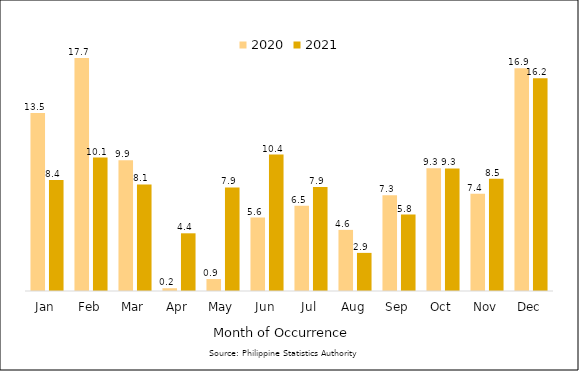
| Category | 2020 | 2021 |
|---|---|---|
| Jan | 13.543 | 8.444 |
| Feb | 17.715 | 10.147 |
| Mar | 9.948 | 8.105 |
| Apr | 0.211 | 4.388 |
| May | 0.909 | 7.876 |
| Jun | 5.586 | 10.377 |
| Jul | 6.485 | 7.91 |
| Aug | 4.647 | 2.898 |
| Sep | 7.29 | 5.814 |
| Oct | 9.33 | 9.319 |
| Nov | 7.388 | 8.541 |
| Dec | 16.948 | 16.183 |